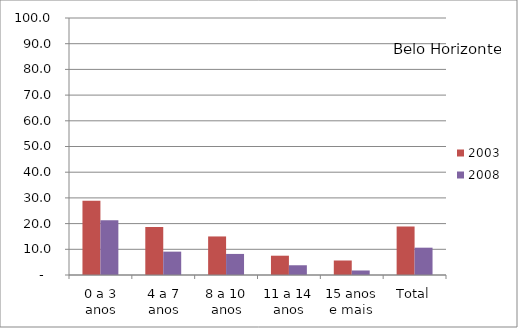
| Category | 2003 | 2008 |
|---|---|---|
| 0 a 3 anos | 28.92 | 21.29 |
| 4 a 7 anos | 18.68 | 9.09 |
| 8 a 10 anos | 15 | 8.2 |
| 11 a 14 anos | 7.51 | 3.79 |
| 15 anos e mais | 5.64 | 1.76 |
| Total | 18.87 | 10.63 |